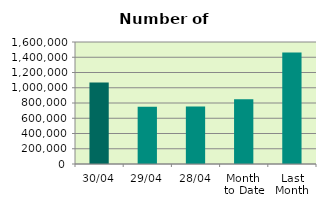
| Category | Series 0 |
|---|---|
| 30/04 | 1068400 |
| 29/04 | 750426 |
| 28/04 | 755400 |
| Month 
to Date | 848119.7 |
| Last
Month | 1462822.818 |